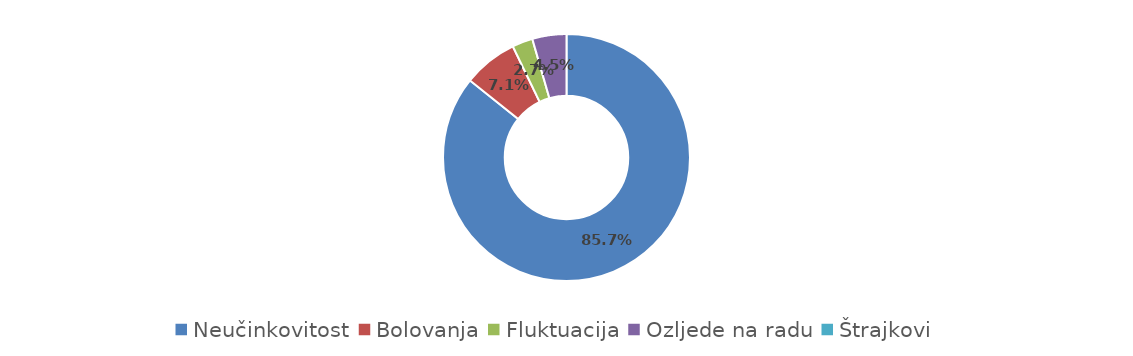
| Category | Series 0 |
|---|---|
| Neučinkovitost | 0.857 |
| Bolovanja | 0.071 |
| Fluktuacija | 0.027 |
| Ozljede na radu | 0.045 |
| Štrajkovi | 0 |